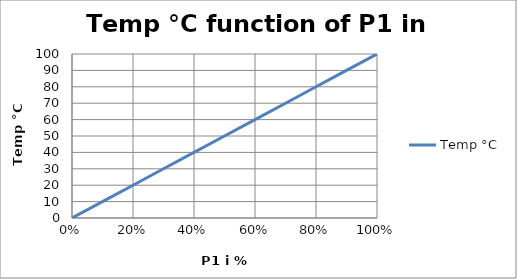
| Category | Temp °C |
|---|---|
| 0.0 | 0 |
| 0.2 | 20 |
| 0.4 | 40 |
| 0.6 | 60 |
| 0.8 | 80 |
| 1.0 | 100 |